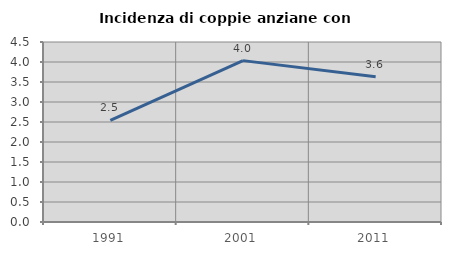
| Category | Incidenza di coppie anziane con figli |
|---|---|
| 1991.0 | 2.539 |
| 2001.0 | 4.035 |
| 2011.0 | 3.63 |